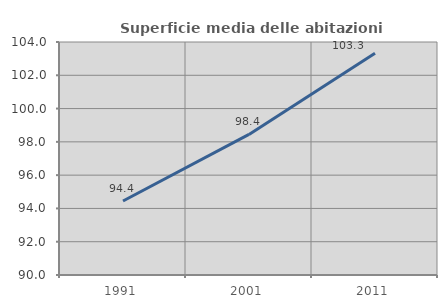
| Category | Superficie media delle abitazioni occupate |
|---|---|
| 1991.0 | 94.449 |
| 2001.0 | 98.448 |
| 2011.0 | 103.324 |